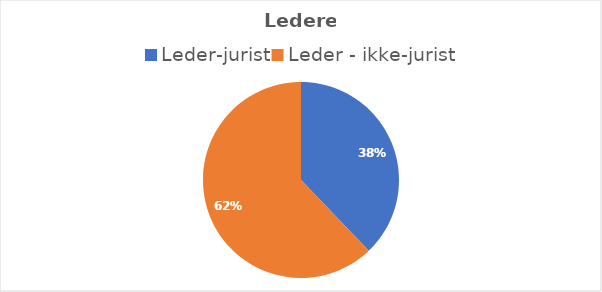
| Category | Series 0 |
|---|---|
| Leder-jurist | 28 |
| Leder - ikke-jurist | 46 |